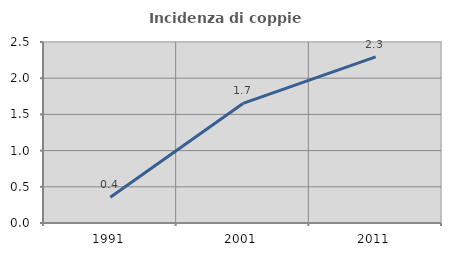
| Category | Incidenza di coppie miste |
|---|---|
| 1991.0 | 0.356 |
| 2001.0 | 1.652 |
| 2011.0 | 2.294 |